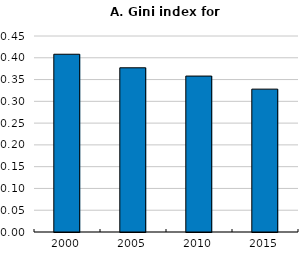
| Category | Series 0 |
|---|---|
| 2000.0 | 0.408 |
| 2005.0 | 0.377 |
| 2010.0 | 0.358 |
| 2015.0 | 0.328 |